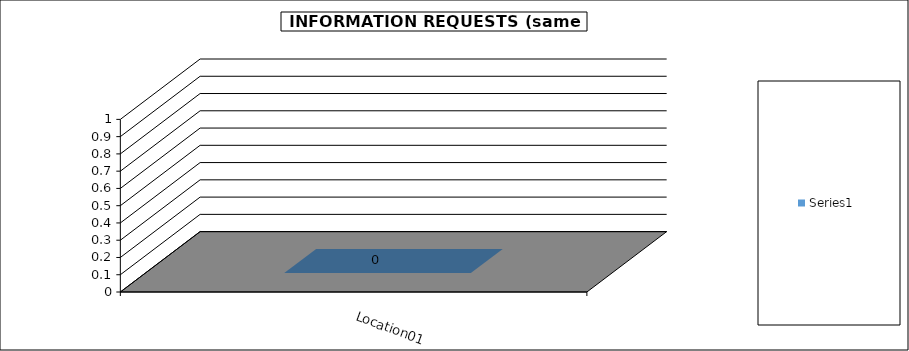
| Category | Series 0 |
|---|---|
| Location01 | 0 |